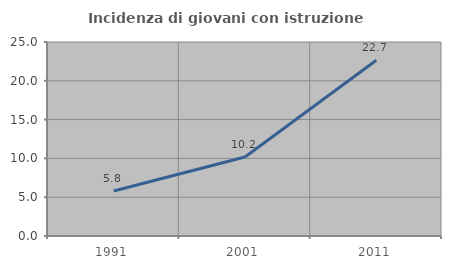
| Category | Incidenza di giovani con istruzione universitaria |
|---|---|
| 1991.0 | 5.795 |
| 2001.0 | 10.184 |
| 2011.0 | 22.651 |